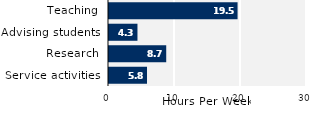
| Category | Series 0 |
|---|---|
| Service activities | 5.759 |
| Research | 8.67 |
| Advising students | 4.313 |
| Teaching | 19.48 |